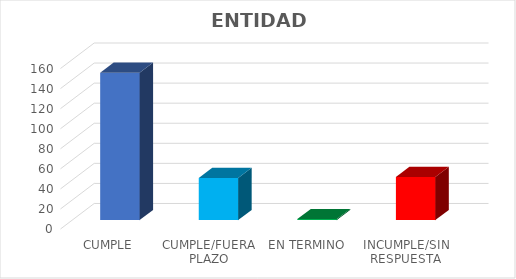
| Category | TOTAL |
|---|---|
| CUMPLE | 147 |
| CUMPLE/FUERA PLAZO | 42 |
| EN TERMINO | 1 |
| INCUMPLE/SIN RESPUESTA | 43 |